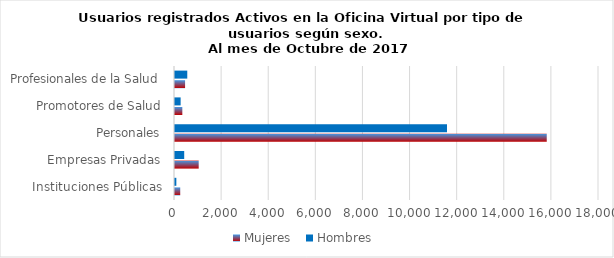
| Category | Mujeres | Hombres |
|---|---|---|
| Instituciones Públicas | 222 | 57 |
| Empresas Privadas | 1006 | 391 |
| Personales | 15782 | 11547 |
| Promotores de Salud | 311 | 239 |
| Profesionales de la Salud | 428 | 521 |